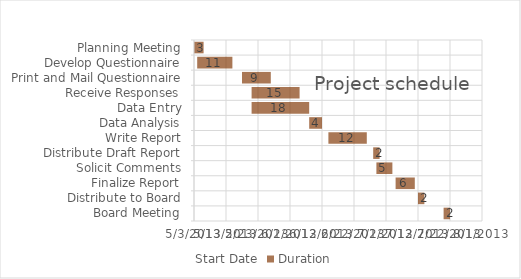
| Category | Start Date | Duration |
|---|---|---|
| Planning Meeting | 5/3/13 | 3 |
| Develop Questionnaire | 5/4/13 | 11 |
| Print and Mail Questionnaire | 5/18/13 | 9 |
| Receive Responses | 5/21/13 | 15 |
| Data Entry | 5/21/13 | 18 |
| Data Analysis | 6/8/13 | 4 |
| Write Report | 6/14/13 | 12 |
| Distribute Draft Report | 6/28/13 | 2 |
| Solicit Comments | 6/29/13 | 5 |
| Finalize Report | 7/5/13 | 6 |
| Distribute to Board | 7/12/13 | 2 |
| Board Meeting | 7/20/13 | 2 |